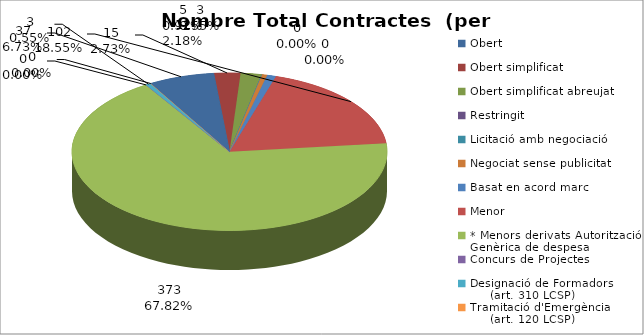
| Category | Nombre Total Contractes |
|---|---|
| Obert | 37 |
| Obert simplificat | 15 |
| Obert simplificat abreujat | 12 |
| Restringit | 0 |
| Licitació amb negociació | 0 |
| Negociat sense publicitat | 3 |
| Basat en acord marc | 5 |
| Menor | 102 |
| * Menors derivats Autorització Genèrica de despesa | 373 |
| Concurs de Projectes | 0 |
| Designació de Formadors
     (art. 310 LCSP) | 3 |
| Tramitació d'Emergència
     (art. 120 LCSP) | 0 |